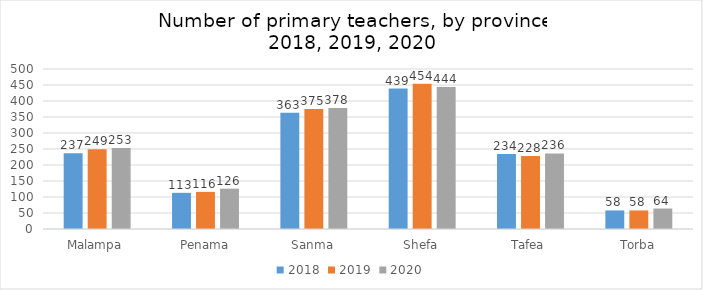
| Category | 2018 | 2019 | 2020 |
|---|---|---|---|
| Malampa | 237 | 249 | 253 |
| Penama | 113 | 116 | 126 |
| Sanma | 363 | 375 | 378 |
| Shefa | 439 | 454 | 444 |
| Tafea | 234 | 228 | 236 |
| Torba | 58 | 58 | 64 |